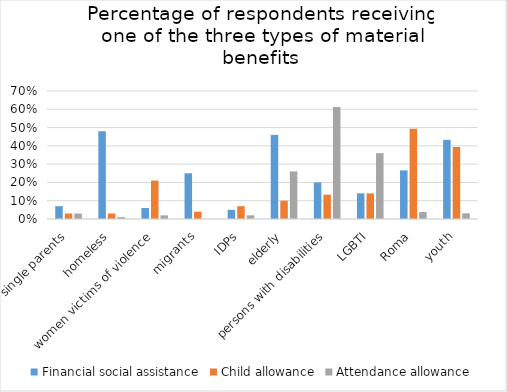
| Category | Financial social assistance | Child allowance | Attendance allowance |
|---|---|---|---|
| single parents | 0.07 | 0.03 | 0.03 |
| homeless | 0.48 | 0.03 | 0.01 |
| women victims of violence | 0.06 | 0.21 | 0.02 |
| migrants | 0.25 | 0.04 | 0 |
| IDPs | 0.05 | 0.07 | 0.02 |
| elderly | 0.46 | 0.1 | 0.26 |
| persons with disabilities | 0.2 | 0.133 | 0.613 |
| LGBTI | 0.14 | 0.14 | 0.36 |
| Roma | 0.266 | 0.494 | 0.038 |
| youth | 0.433 | 0.394 | 0.031 |